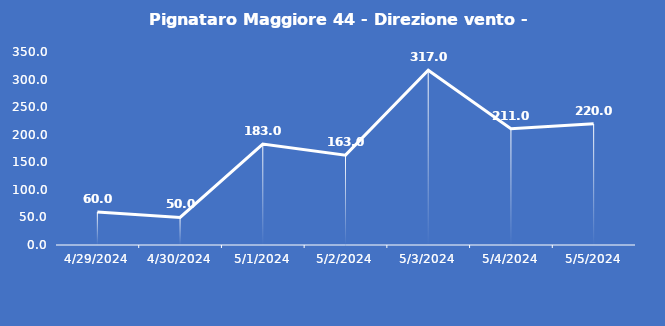
| Category | Pignataro Maggiore 44 - Direzione vento - Grezzo (°N) |
|---|---|
| 4/29/24 | 60 |
| 4/30/24 | 50 |
| 5/1/24 | 183 |
| 5/2/24 | 163 |
| 5/3/24 | 317 |
| 5/4/24 | 211 |
| 5/5/24 | 220 |